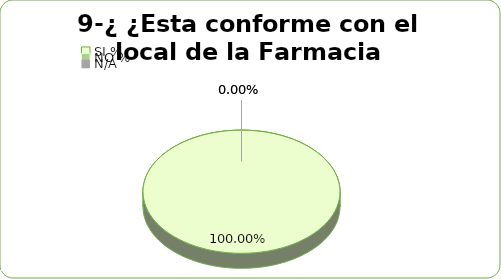
| Category | Series 0 |
|---|---|
| SI % | 1 |
| NO % | 0 |
| N/A | 0 |